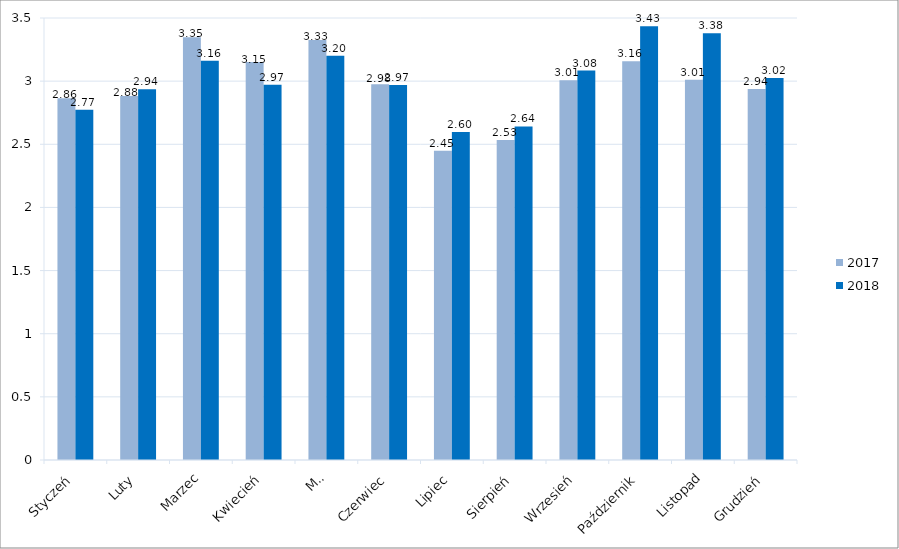
| Category | 2017 | 2018 |
|---|---|---|
| Styczeń | 2.865 | 2.773 |
| Luty | 2.882 | 2.935 |
| Marzec | 3.348 | 3.162 |
| Kwiecień | 3.151 | 2.971 |
| Maj | 3.326 | 3.201 |
| Czerwiec | 2.976 | 2.969 |
| Lipiec | 2.45 | 2.597 |
| Sierpień | 2.534 | 2.641 |
| Wrzesień | 3.006 | 3.084 |
| Październik | 3.157 | 3.434 |
| Listopad | 3.012 | 3.379 |
| Grudzień | 2.938 | 3.025 |